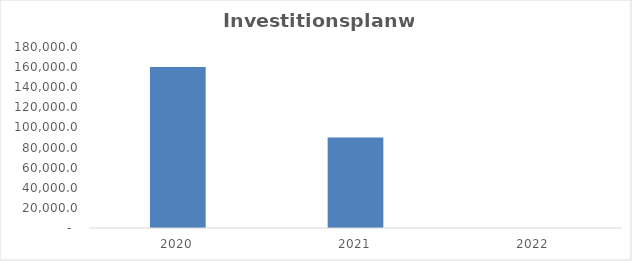
| Category | Investitionsplanwert |
|---|---|
| 2020.0 | 160000 |
| 2021.0 | 90000 |
| 2022.0 | 0 |